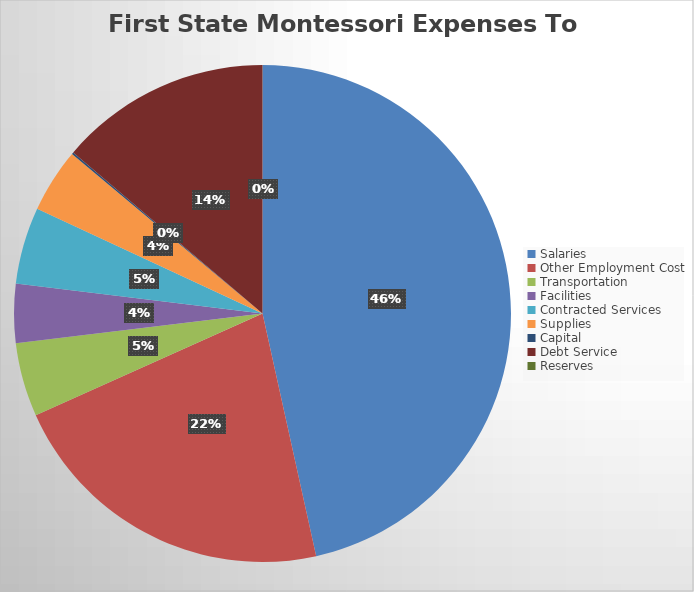
| Category | Series 0 |
|---|---|
| Salaries | 2580616.19 |
| Other Employment Cost | 1206219.2 |
| Transportation | 266358.45 |
| Facilities | 213065.58 |
| Contracted Services | 277181.09 |
| Supplies | 231233.6 |
| Capital | 6645.6 |
| Debt Service | 764340.32 |
| Reserves | 0 |